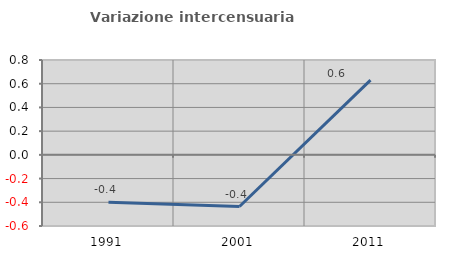
| Category | Variazione intercensuaria annua |
|---|---|
| 1991.0 | -0.4 |
| 2001.0 | -0.436 |
| 2011.0 | 0.631 |